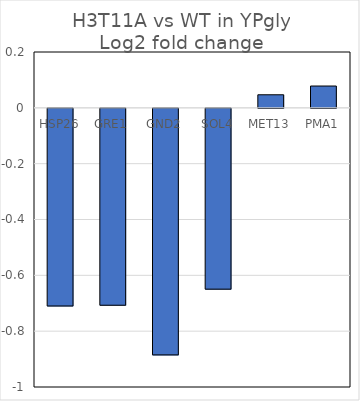
| Category | Log2 fold change |
|---|---|
| HSP26 | -0.708 |
| GRE1 | -0.705 |
| GND2 | -0.883 |
| SOL4 | -0.648 |
| MET13 | 0.047 |
| PMA1 | 0.078 |